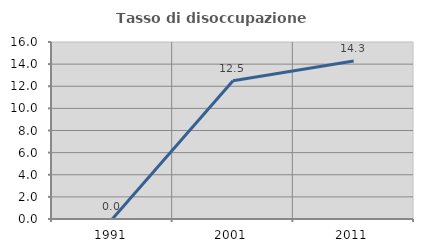
| Category | Tasso di disoccupazione giovanile  |
|---|---|
| 1991.0 | 0 |
| 2001.0 | 12.5 |
| 2011.0 | 14.286 |